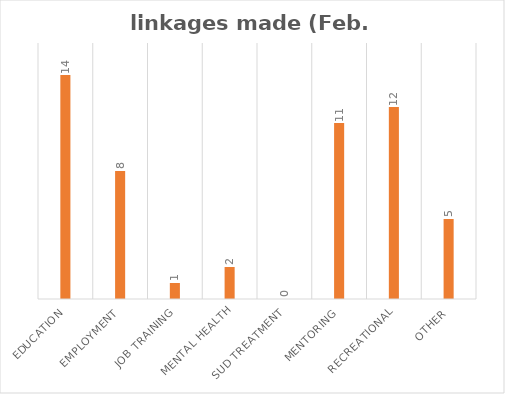
| Category | Series 0 |
|---|---|
| Education | 14 |
| Employment | 8 |
| Job Training | 1 |
| Mental Health | 2 |
| SUD Treatment | 0 |
| Mentoring | 11 |
| Recreational | 12 |
| Other | 5 |